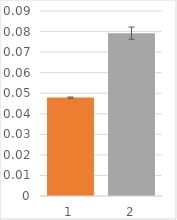
| Category | Series 0 |
|---|---|
| 0 | 0.048 |
| 1 | 0.079 |